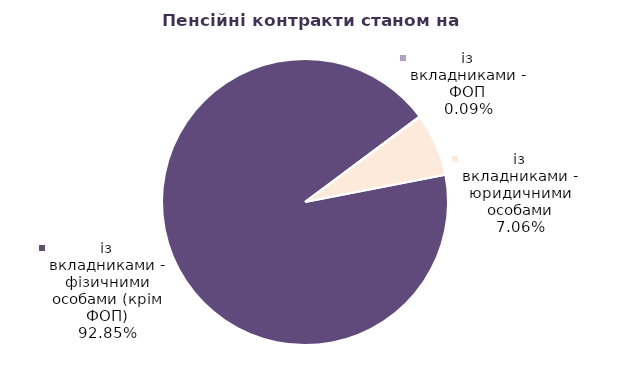
| Category | Series 0 |
|---|---|
| із вкладниками - фізичними особами (крім ФОП) | 87316 |
| із вкладниками - ФОП | 84 |
| із вкладниками - юридичними особами | 6643 |